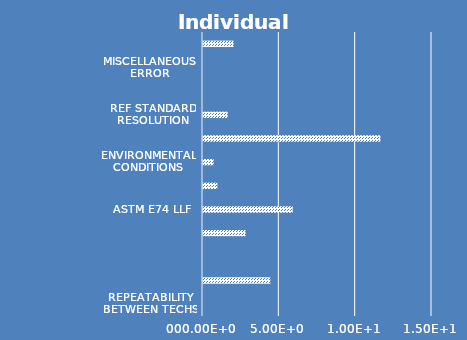
| Category | Individual Contributors |
|---|---|
| Repeatability Between Techs | 0 |
| Reproducibility Between Techs | 4.412 |
|  | 0 |
| Repeatability | 2.785 |
| ASTM E74 LLF  | 5.875 |
| Resolution of UUT | 0.938 |
| Environmental Conditions | 0.693 |
| Stability of  Ref Standard | 11.624 |
| Ref Standard Resolution | 1.617 |
| Non ASTM or ISO 376 (Tolerance,Non-Linearity,SEB) | 0 |
| Miscellaneous Error | 0 |
| Morehouse CMC (Ref Lab) | 2 |